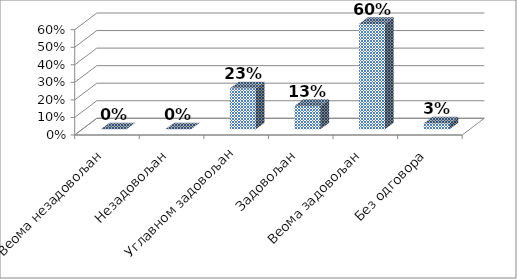
| Category | Series 0 |
|---|---|
| Веома незадовољан | 0 |
| Незадовољан | 0 |
| Углавном задовољан | 0.233 |
| Задовољан | 0.133 |
| Веома задовољан | 0.6 |
| Без одговора | 0.033 |